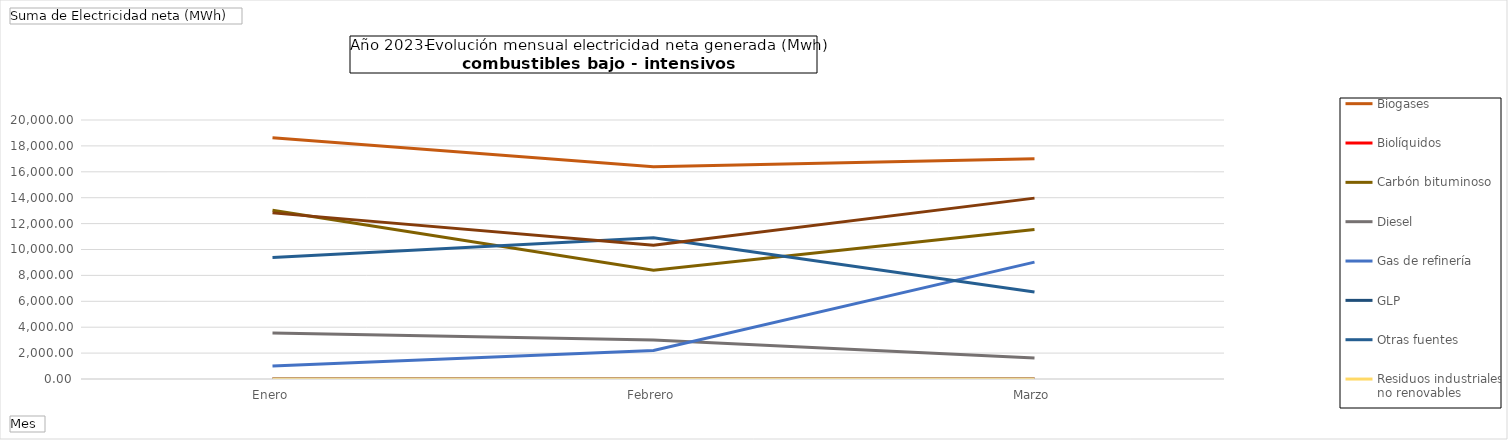
| Category | Biogases | Biolíquidos | Carbón bituminoso | Diesel | Gas de refinería | GLP | Otras fuentes | Residuos industriales no renovables | Residuos urbanos |
|---|---|---|---|---|---|---|---|---|---|
| Enero | 18634.94 | 0 | 13028.06 | 3561.16 | 1001.47 | 9.35 | 9382.51 | 0 | 12828.45 |
| Febrero | 16397.35 | 0 | 8395.17 | 3003.51 | 2205 | 0 | 10915.52 | 0 | 10325.86 |
| Marzo | 17007.89 | 0 | 11542.86 | 1628.15 | 9025.75 | 0 | 6713.09 | 0 | 13966.76 |